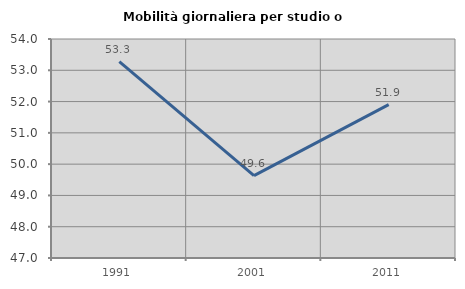
| Category | Mobilità giornaliera per studio o lavoro |
|---|---|
| 1991.0 | 53.276 |
| 2001.0 | 49.631 |
| 2011.0 | 51.902 |